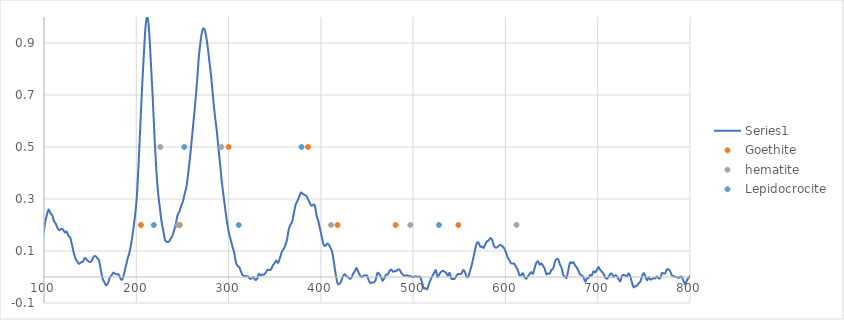
| Category | Series 0 |
|---|---|
| 1400.91602 | 0.064 |
| 1399.26172 | 0.057 |
| 1397.60742 | 0.071 |
| 1395.95313 | 0.093 |
| 1394.29883 | 0.119 |
| 1392.64258 | 0.128 |
| 1390.98828 | 0.144 |
| 1389.33203 | 0.142 |
| 1387.67578 | 0.134 |
| 1386.01758 | 0.129 |
| 1384.36133 | 0.134 |
| 1382.70313 | 0.151 |
| 1381.04688 | 0.18 |
| 1379.38867 | 0.176 |
| 1377.72852 | 0.195 |
| 1376.07031 | 0.202 |
| 1374.41016 | 0.173 |
| 1372.75195 | 0.185 |
| 1371.0918 | 0.185 |
| 1369.43164 | 0.189 |
| 1367.76953 | 0.193 |
| 1366.10938 | 0.193 |
| 1364.44727 | 0.203 |
| 1362.78516 | 0.211 |
| 1361.12305 | 0.207 |
| 1359.46094 | 0.225 |
| 1357.79688 | 0.219 |
| 1356.13281 | 0.207 |
| 1354.46875 | 0.185 |
| 1352.80469 | 0.186 |
| 1351.14063 | 0.185 |
| 1349.47656 | 0.18 |
| 1347.81055 | 0.201 |
| 1346.14453 | 0.217 |
| 1344.47852 | 0.225 |
| 1342.8125 | 0.229 |
| 1341.14453 | 0.218 |
| 1339.47852 | 0.216 |
| 1337.81055 | 0.24 |
| 1336.14258 | 0.231 |
| 1334.47461 | 0.247 |
| 1332.80469 | 0.239 |
| 1331.13477 | 0.236 |
| 1329.4668 | 0.228 |
| 1327.79688 | 0.201 |
| 1326.125 | 0.191 |
| 1324.45508 | 0.212 |
| 1322.78516 | 0.211 |
| 1321.11328 | 0.244 |
| 1319.44141 | 0.248 |
| 1317.76953 | 0.264 |
| 1316.0957 | 0.282 |
| 1314.42383 | 0.273 |
| 1312.75 | 0.276 |
| 1311.07617 | 0.29 |
| 1309.40234 | 0.288 |
| 1307.72656 | 0.29 |
| 1306.05273 | 0.287 |
| 1304.37695 | 0.265 |
| 1302.70117 | 0.283 |
| 1301.02539 | 0.292 |
| 1299.34961 | 0.294 |
| 1297.67188 | 0.291 |
| 1295.99609 | 0.272 |
| 1294.31836 | 0.264 |
| 1292.64063 | 0.274 |
| 1290.96094 | 0.259 |
| 1289.2832 | 0.293 |
| 1287.60352 | 0.308 |
| 1285.92383 | 0.295 |
| 1284.24414 | 0.284 |
| 1282.56445 | 0.292 |
| 1280.88281 | 0.32 |
| 1279.20313 | 0.357 |
| 1277.52148 | 0.36 |
| 1275.83984 | 0.351 |
| 1274.1582 | 0.313 |
| 1272.47461 | 0.277 |
| 1270.79297 | 0.251 |
| 1269.10938 | 0.244 |
| 1267.42578 | 0.266 |
| 1265.74023 | 0.318 |
| 1264.05664 | 0.314 |
| 1262.37109 | 0.301 |
| 1260.68555 | 0.293 |
| 1259.0 | 0.267 |
| 1257.31445 | 0.229 |
| 1255.62891 | 0.208 |
| 1253.94141 | 0.217 |
| 1252.25391 | 0.239 |
| 1250.56641 | 0.236 |
| 1248.87891 | 0.25 |
| 1247.19141 | 0.257 |
| 1245.50195 | 0.245 |
| 1243.8125 | 0.217 |
| 1242.12305 | 0.193 |
| 1240.43359 | 0.177 |
| 1238.74414 | 0.163 |
| 1237.05273 | 0.153 |
| 1235.36133 | 0.161 |
| 1233.66992 | 0.156 |
| 1231.97852 | 0.159 |
| 1230.28711 | 0.144 |
| 1228.59375 | 0.119 |
| 1226.90039 | 0.108 |
| 1225.20703 | 0.118 |
| 1223.51367 | 0.123 |
| 1221.82031 | 0.134 |
| 1220.125 | 0.14 |
| 1218.42969 | 0.134 |
| 1216.73438 | 0.122 |
| 1215.03906 | 0.095 |
| 1213.34375 | 0.077 |
| 1211.64648 | 0.084 |
| 1209.95117 | 0.069 |
| 1208.25391 | 0.062 |
| 1206.55469 | 0.05 |
| 1204.85742 | 0.038 |
| 1203.1582 | 0.025 |
| 1201.46094 | 0.012 |
| 1199.76172 | 0.018 |
| 1198.0625 | 0.024 |
| 1196.36133 | 0.022 |
| 1194.66211 | 0.035 |
| 1192.96094 | 0.032 |
| 1191.25977 | 0.036 |
| 1189.55859 | 0.039 |
| 1187.85547 | 0.029 |
| 1186.1543 | 0.043 |
| 1184.45117 | 0.039 |
| 1182.74805 | 0.016 |
| 1181.04492 | 0.008 |
| 1179.33984 | 0.002 |
| 1177.63672 | -0.011 |
| 1175.93164 | -0.008 |
| 1174.22656 | -0.001 |
| 1172.52148 | 0.013 |
| 1170.81641 | 0.017 |
| 1169.10938 | 0.006 |
| 1167.40234 | 0.012 |
| 1165.69531 | 0.016 |
| 1163.98828 | 0.011 |
| 1162.28125 | 0.012 |
| 1160.57227 | 0.013 |
| 1158.86328 | -0.008 |
| 1157.1543 | -0.025 |
| 1155.44531 | -0.016 |
| 1153.73633 | 0 |
| 1152.02539 | 0.002 |
| 1150.31445 | 0.007 |
| 1148.60352 | 0.01 |
| 1146.89258 | 0.004 |
| 1145.18164 | -0.012 |
| 1143.46875 | -0.022 |
| 1141.75586 | -0.006 |
| 1140.04297 | 0.015 |
| 1138.33008 | -0.002 |
| 1136.61719 | -0.004 |
| 1134.90234 | 0.013 |
| 1133.1875 | -0.006 |
| 1131.47266 | -0.012 |
| 1129.75781 | -0.009 |
| 1128.04297 | -0.008 |
| 1126.32617 | 0.004 |
| 1124.60938 | 0.002 |
| 1122.89258 | -0.001 |
| 1121.17578 | 0.007 |
| 1119.45898 | -0.007 |
| 1117.74023 | 0.003 |
| 1116.02148 | -0.001 |
| 1114.30273 | -0.015 |
| 1112.58398 | -0.001 |
| 1110.86328 | 0 |
| 1109.14453 | -0.017 |
| 1107.42383 | -0.004 |
| 1105.70313 | -0.005 |
| 1103.98242 | 0.002 |
| 1102.25977 | 0.002 |
| 1100.53711 | -0.007 |
| 1098.81641 | -0.008 |
| 1097.09375 | -0.016 |
| 1095.36914 | -0.031 |
| 1093.64648 | -0.02 |
| 1091.92188 | -0.03 |
| 1090.19727 | -0.027 |
| 1088.47266 | -0.011 |
| 1086.74805 | 0 |
| 1085.02148 | -0.021 |
| 1083.29688 | -0.003 |
| 1081.57031 | 0.003 |
| 1079.84375 | 0.018 |
| 1078.11523 | 0.004 |
| 1076.38867 | 0 |
| 1074.66016 | 0.007 |
| 1072.93164 | 0.012 |
| 1071.20313 | -0.023 |
| 1069.47461 | -0.004 |
| 1067.74414 | -0.002 |
| 1066.01367 | 0 |
| 1064.2832 | -0.019 |
| 1062.55273 | -0.01 |
| 1060.82227 | -0.012 |
| 1059.08984 | -0.008 |
| 1057.35742 | -0.009 |
| 1055.625 | 0.003 |
| 1053.89258 | 0.008 |
| 1052.16016 | 0.014 |
| 1050.42578 | 0.01 |
| 1048.69141 | 0.016 |
| 1046.95703 | 0.013 |
| 1045.22266 | 0.02 |
| 1043.48828 | 0.021 |
| 1041.75195 | 0.015 |
| 1040.01563 | 0.026 |
| 1038.2793 | 0.022 |
| 1036.54297 | 0 |
| 1034.80664 | 0.007 |
| 1033.06836 | -0.015 |
| 1031.33008 | -0.016 |
| 1029.5918 | -0.016 |
| 1027.85352 | -0.013 |
| 1026.11328 | 0.024 |
| 1024.375 | 0.036 |
| 1022.63477 | 0.028 |
| 1020.89258 | 0.045 |
| 1019.15234 | 0.018 |
| 1017.41211 | 0.009 |
| 1015.66992 | 0.001 |
| 1013.92773 | 0.009 |
| 1012.18555 | 0.017 |
| 1010.44336 | 0.015 |
| 1008.69922 | 0.014 |
| 1006.95508 | 0.014 |
| 1005.21094 | 0.004 |
| 1003.4668 | -0.007 |
| 1001.72266 | -0.011 |
| 999.97656 | 0.008 |
| 998.23047 | 0.01 |
| 996.48438 | 0.017 |
| 994.73828 | 0.021 |
| 992.99219 | 0.028 |
| 991.24414 | 0.019 |
| 989.49609 | 0.011 |
| 987.74805 | 0.005 |
| 986.0 | 0.004 |
| 984.25 | 0.003 |
| 982.50195 | 0.013 |
| 980.75195 | 0.008 |
| 979.00195 | 0.029 |
| 977.25 | 0.038 |
| 975.5 | 0.047 |
| 973.74805 | 0.044 |
| 971.99609 | 0.032 |
| 970.24414 | 0.016 |
| 968.49219 | 0.013 |
| 966.73828 | -0.014 |
| 964.98438 | -0.001 |
| 963.23047 | 0.007 |
| 961.47656 | 0.013 |
| 959.72266 | 0.019 |
| 957.9668 | 0.006 |
| 956.21094 | 0 |
| 954.45508 | -0.018 |
| 952.69922 | -0.027 |
| 950.94336 | -0.008 |
| 949.18555 | -0.012 |
| 947.42773 | 0.006 |
| 945.66992 | 0.035 |
| 943.91211 | 0.044 |
| 942.15234 | 0.046 |
| 940.39453 | 0.035 |
| 938.63477 | 0.032 |
| 936.875 | 0.028 |
| 935.11328 | 0.015 |
| 933.35352 | 0.017 |
| 931.5918 | 0.021 |
| 929.83008 | 0.031 |
| 928.06836 | 0.02 |
| 926.30664 | 0.019 |
| 924.54297 | 0.016 |
| 922.7793 | 0.012 |
| 921.01563 | 0.023 |
| 919.25195 | 0.031 |
| 917.48633 | 0.027 |
| 915.72266 | 0.034 |
| 913.95703 | 0.022 |
| 912.19141 | 0.012 |
| 910.42578 | 0.003 |
| 908.6582 | -0.014 |
| 906.89063 | -0.011 |
| 905.12305 | 0.007 |
| 903.35547 | 0.011 |
| 901.58789 | 0.022 |
| 899.81836 | 0.021 |
| 898.05078 | 0.025 |
| 896.28125 | 0.001 |
| 894.51172 | -0.014 |
| 892.74023 | -0.015 |
| 890.9707 | -0.014 |
| 889.19922 | -0.01 |
| 887.42773 | -0.005 |
| 885.6543 | -0.003 |
| 883.88281 | 0.007 |
| 882.10938 | -0.004 |
| 880.33594 | 0.003 |
| 878.5625 | -0.001 |
| 876.78906 | 0 |
| 875.01367 | -0.011 |
| 873.24023 | -0.015 |
| 871.46484 | 0.003 |
| 869.68945 | 0.005 |
| 867.91211 | 0.017 |
| 866.13672 | 0.018 |
| 864.35938 | 0.021 |
| 862.58203 | 0.027 |
| 860.80469 | 0 |
| 859.02539 | -0.007 |
| 857.24609 | -0.01 |
| 855.46875 | -0.018 |
| 853.68945 | -0.016 |
| 851.9082 | -0.016 |
| 850.12891 | -0.003 |
| 848.34766 | 0.011 |
| 846.56641 | 0.007 |
| 844.78516 | 0.015 |
| 843.00391 | 0.013 |
| 841.2207 | 0.011 |
| 839.4375 | -0.011 |
| 837.6543 | -0.017 |
| 835.87109 | -0.023 |
| 834.08594 | -0.024 |
| 832.30273 | -0.014 |
| 830.51758 | -0.008 |
| 828.73242 | 0.002 |
| 826.94727 | 0.005 |
| 825.16016 | -0.009 |
| 823.37305 | 0.002 |
| 821.58594 | 0.004 |
| 819.79883 | 0.013 |
| 818.01172 | 0.025 |
| 816.22266 | 0.019 |
| 814.43359 | 0.025 |
| 812.64453 | 0.028 |
| 810.85547 | 0.015 |
| 809.06641 | 0.008 |
| 807.27539 | 0.012 |
| 805.48438 | 0.024 |
| 803.69336 | 0.023 |
| 801.90234 | 0.017 |
| 800.10938 | 0.004 |
| 798.31836 | -0.003 |
| 796.52539 | -0.014 |
| 794.73047 | -0.029 |
| 792.9375 | -0.015 |
| 791.14258 | 0.001 |
| 789.34961 | 0.001 |
| 787.55469 | -0.004 |
| 785.75781 | 0 |
| 783.96289 | 0.001 |
| 782.16602 | 0.004 |
| 780.36914 | 0.006 |
| 778.57227 | 0.023 |
| 776.77539 | 0.029 |
| 774.97656 | 0.029 |
| 773.17773 | 0.015 |
| 771.37891 | 0.014 |
| 769.58008 | 0.015 |
| 767.78125 | -0.004 |
| 765.98047 | -0.005 |
| 764.17969 | 0.002 |
| 762.37891 | -0.006 |
| 760.57813 | -0.004 |
| 758.77539 | -0.008 |
| 756.97461 | -0.01 |
| 755.17188 | -0.002 |
| 753.36914 | -0.013 |
| 751.56445 | 0.004 |
| 749.76172 | 0.015 |
| 747.95703 | 0.001 |
| 746.15234 | -0.018 |
| 744.34766 | -0.024 |
| 742.54102 | -0.033 |
| 740.73438 | -0.035 |
| 738.92969 | -0.039 |
| 737.12109 | -0.022 |
| 735.31445 | 0.002 |
| 733.50586 | 0.014 |
| 731.69922 | 0.003 |
| 729.89063 | 0.006 |
| 728.08008 | 0.008 |
| 726.27148 | 0.005 |
| 724.46094 | -0.016 |
| 722.65234 | -0.009 |
| 720.83984 | 0.003 |
| 719.0293 | 0.007 |
| 717.21875 | -0.001 |
| 715.40625 | 0.013 |
| 713.59375 | 0.012 |
| 711.78125 | 0 |
| 709.9668 | -0.007 |
| 708.1543 | -0.001 |
| 706.33984 | 0.012 |
| 704.52539 | 0.02 |
| 702.70898 | 0.028 |
| 700.89453 | 0.038 |
| 699.07813 | 0.027 |
| 697.26172 | 0.018 |
| 695.44531 | 0.022 |
| 693.62891 | 0.006 |
| 691.81055 | 0.008 |
| 689.99219 | -0.003 |
| 688.17383 | -0.007 |
| 686.35547 | -0.017 |
| 684.53516 | 0 |
| 682.7168 | 0.006 |
| 680.89648 | 0.01 |
| 679.07617 | 0.024 |
| 677.25391 | 0.037 |
| 675.43359 | 0.045 |
| 673.61133 | 0.056 |
| 671.78906 | 0.053 |
| 669.9668 | 0.055 |
| 668.14258 | 0.027 |
| 666.31836 | -0.003 |
| 664.49609 | 0.001 |
| 662.66992 | 0.008 |
| 660.8457 | 0.034 |
| 659.01953 | 0.049 |
| 657.19531 | 0.067 |
| 655.36914 | 0.069 |
| 653.54102 | 0.057 |
| 651.71484 | 0.032 |
| 649.88672 | 0.028 |
| 648.05859 | 0.013 |
| 646.23047 | 0.014 |
| 644.40234 | 0.011 |
| 642.57227 | 0.031 |
| 640.74219 | 0.043 |
| 638.91211 | 0.052 |
| 637.08203 | 0.048 |
| 635.25195 | 0.06 |
| 633.41992 | 0.054 |
| 631.58789 | 0.034 |
| 629.75586 | 0.012 |
| 627.92383 | 0.019 |
| 626.08984 | 0.011 |
| 624.25586 | 0.002 |
| 622.42188 | -0.007 |
| 620.58789 | 0 |
| 618.75391 | 0.015 |
| 616.91797 | 0.007 |
| 615.08203 | 0.008 |
| 613.24609 | 0.028 |
| 611.4082 | 0.04 |
| 609.57227 | 0.051 |
| 607.73438 | 0.052 |
| 605.89648 | 0.054 |
| 604.05859 | 0.066 |
| 602.21875 | 0.077 |
| 600.38086 | 0.097 |
| 598.54102 | 0.11 |
| 596.69922 | 0.118 |
| 594.85938 | 0.123 |
| 593.01758 | 0.121 |
| 591.17773 | 0.114 |
| 589.33594 | 0.113 |
| 587.49219 | 0.12 |
| 585.65039 | 0.143 |
| 583.80664 | 0.15 |
| 581.96289 | 0.141 |
| 580.11914 | 0.137 |
| 578.27539 | 0.127 |
| 576.42969 | 0.112 |
| 574.58398 | 0.117 |
| 572.73828 | 0.117 |
| 570.89258 | 0.132 |
| 569.04492 | 0.131 |
| 567.19922 | 0.106 |
| 565.35156 | 0.076 |
| 563.50195 | 0.046 |
| 561.6543 | 0.023 |
| 559.80469 | 0.001 |
| 557.95508 | 0.001 |
| 556.10547 | 0.019 |
| 554.25586 | 0.027 |
| 552.4043 | 0.013 |
| 550.55469 | 0.011 |
| 548.70313 | 0.011 |
| 546.84961 | 0.005 |
| 544.99805 | -0.006 |
| 543.14453 | -0.008 |
| 541.29102 | -0.006 |
| 539.4375 | 0.016 |
| 537.58398 | 0.005 |
| 535.72852 | 0.016 |
| 533.875 | 0.021 |
| 532.01953 | 0.024 |
| 530.16211 | 0.019 |
| 528.30664 | 0.01 |
| 526.44922 | 0 |
| 524.5918 | 0.026 |
| 522.73438 | 0.015 |
| 520.87695 | 0.005 |
| 519.01758 | -0.01 |
| 517.1582 | -0.026 |
| 515.29883 | -0.046 |
| 513.43945 | -0.043 |
| 511.57813 | -0.043 |
| 509.7168 | -0.022 |
| 507.85547 | 0 |
| 505.99414 | 0.001 |
| 504.13281 | 0.001 |
| 502.26953 | 0.003 |
| 500.40625 | -0.001 |
| 498.54297 | 0.002 |
| 496.67969 | 0.003 |
| 494.81445 | 0.005 |
| 492.94922 | 0.006 |
| 491.08398 | 0.005 |
| 489.21875 | 0.008 |
| 487.35352 | 0.015 |
| 485.48633 | 0.027 |
| 483.61914 | 0.029 |
| 481.75195 | 0.023 |
| 479.88281 | 0.023 |
| 478.01563 | 0.021 |
| 476.14648 | 0.029 |
| 474.27734 | 0.022 |
| 472.4082 | 0.01 |
| 470.53711 | 0.008 |
| 468.66602 | -0.005 |
| 466.79492 | -0.014 |
| 464.92383 | 0.002 |
| 463.05273 | 0.013 |
| 461.17969 | 0.014 |
| 459.30664 | -0.012 |
| 457.43359 | -0.02 |
| 455.55859 | -0.021 |
| 453.68555 | -0.023 |
| 451.81055 | -0.012 |
| 449.93555 | 0.005 |
| 448.06055 | 0.006 |
| 446.18359 | 0.005 |
| 444.30664 | -0.001 |
| 442.42969 | 0.006 |
| 440.55273 | 0.02 |
| 438.67578 | 0.035 |
| 436.79688 | 0.022 |
| 434.91797 | 0.012 |
| 433.03906 | -0.004 |
| 431.16016 | -0.006 |
| 429.2793 | 0.001 |
| 427.39844 | 0.004 |
| 425.51758 | 0.011 |
| 423.63672 | 0 |
| 421.75391 | -0.019 |
| 419.87305 | -0.027 |
| 417.99023 | -0.023 |
| 416.10547 | 0.01 |
| 414.22266 | 0.054 |
| 412.33789 | 0.095 |
| 410.45313 | 0.113 |
| 408.56836 | 0.125 |
| 406.68359 | 0.129 |
| 404.79688 | 0.12 |
| 402.91211 | 0.125 |
| 401.02344 | 0.155 |
| 399.13672 | 0.184 |
| 397.25 | 0.216 |
| 395.36133 | 0.237 |
| 393.47266 | 0.275 |
| 391.58398 | 0.277 |
| 389.69336 | 0.274 |
| 387.80469 | 0.287 |
| 385.91406 | 0.3 |
| 384.02344 | 0.312 |
| 382.13086 | 0.316 |
| 380.24023 | 0.32 |
| 378.34766 | 0.324 |
| 376.45508 | 0.308 |
| 374.56055 | 0.293 |
| 372.66797 | 0.278 |
| 370.77344 | 0.246 |
| 368.87891 | 0.213 |
| 366.98438 | 0.201 |
| 365.08789 | 0.181 |
| 363.19336 | 0.141 |
| 361.29688 | 0.121 |
| 359.40039 | 0.106 |
| 357.50195 | 0.095 |
| 355.60547 | 0.073 |
| 353.70703 | 0.054 |
| 351.80859 | 0.063 |
| 349.9082 | 0.054 |
| 348.00977 | 0.045 |
| 346.10938 | 0.03 |
| 344.20898 | 0.026 |
| 342.30859 | 0.028 |
| 340.40625 | 0.018 |
| 338.50391 | 0.009 |
| 336.60156 | 0.009 |
| 334.69922 | 0.007 |
| 332.79688 | 0.012 |
| 330.89258 | -0.007 |
| 328.98828 | -0.011 |
| 327.08398 | -0.001 |
| 325.17969 | -0.004 |
| 323.27344 | -0.007 |
| 321.36719 | 0.002 |
| 319.46094 | 0.002 |
| 317.55469 | 0.004 |
| 315.64648 | 0.005 |
| 313.74023 | 0.018 |
| 311.83203 | 0.037 |
| 309.92188 | 0.042 |
| 308.01367 | 0.056 |
| 306.10352 | 0.092 |
| 304.19336 | 0.118 |
| 302.2832 | 0.143 |
| 300.37305 | 0.17 |
| 298.46094 | 0.207 |
| 296.54883 | 0.257 |
| 294.63672 | 0.31 |
| 292.72461 | 0.365 |
| 290.81055 | 0.434 |
| 288.89648 | 0.501 |
| 286.98242 | 0.569 |
| 285.06836 | 0.624 |
| 283.15234 | 0.692 |
| 281.23828 | 0.767 |
| 279.32227 | 0.827 |
| 277.4043 | 0.884 |
| 275.48828 | 0.929 |
| 273.57031 | 0.955 |
| 271.65234 | 0.949 |
| 269.73438 | 0.908 |
| 267.81641 | 0.848 |
| 265.89648 | 0.755 |
| 263.97656 | 0.671 |
| 262.05664 | 0.6 |
| 260.13672 | 0.529 |
| 258.21484 | 0.46 |
| 256.29297 | 0.4 |
| 254.37109 | 0.348 |
| 252.44922 | 0.32 |
| 250.52539 | 0.29 |
| 248.60156 | 0.274 |
| 246.67773 | 0.251 |
| 244.75391 | 0.238 |
| 242.83008 | 0.205 |
| 240.9043 | 0.179 |
| 238.97852 | 0.157 |
| 237.05273 | 0.147 |
| 235.125 | 0.135 |
| 233.19922 | 0.136 |
| 231.27148 | 0.141 |
| 229.3418 | 0.177 |
| 227.41406 | 0.213 |
| 225.48438 | 0.268 |
| 223.55664 | 0.327 |
| 221.625 | 0.416 |
| 219.69531 | 0.542 |
| 217.76563 | 0.694 |
| 215.83398 | 0.823 |
| 213.90234 | 0.945 |
| 211.96875 | 1 |
| 210.03711 | 0.963 |
| 208.10352 | 0.851 |
| 206.16992 | 0.721 |
| 204.23633 | 0.571 |
| 202.30078 | 0.421 |
| 200.36719 | 0.298 |
| 198.43164 | 0.23 |
| 196.49414 | 0.176 |
| 194.55859 | 0.13 |
| 192.62109 | 0.095 |
| 190.68359 | 0.072 |
| 188.74609 | 0.042 |
| 186.80859 | 0.014 |
| 184.86914 | -0.009 |
| 182.92969 | -0.007 |
| 180.99023 | 0.009 |
| 179.05078 | 0.01 |
| 177.10938 | 0.012 |
| 175.16797 | 0.017 |
| 173.22656 | 0.006 |
| 171.28516 | -0.002 |
| 169.3418 | -0.023 |
| 167.40039 | -0.032 |
| 165.45703 | -0.02 |
| 163.51172 | -0.006 |
| 161.56836 | 0.027 |
| 159.62305 | 0.064 |
| 157.67773 | 0.072 |
| 155.73242 | 0.08 |
| 153.78516 | 0.077 |
| 151.83984 | 0.064 |
| 149.89258 | 0.057 |
| 147.94336 | 0.061 |
| 145.99609 | 0.068 |
| 144.04688 | 0.073 |
| 142.09766 | 0.059 |
| 140.14844 | 0.057 |
| 138.19922 | 0.051 |
| 136.24805 | 0.058 |
| 134.29688 | 0.07 |
| 132.3457 | 0.092 |
| 130.39453 | 0.123 |
| 128.44141 | 0.151 |
| 126.48828 | 0.158 |
| 124.53516 | 0.174 |
| 122.58203 | 0.171 |
| 120.62695 | 0.183 |
| 118.67383 | 0.185 |
| 116.71875 | 0.18 |
| 114.76172 | 0.187 |
| 112.80664 | 0.204 |
| 110.84961 | 0.215 |
| 108.89258 | 0.237 |
| 106.93555 | 0.245 |
| 104.97656 | 0.259 |
| 103.01758 | 0.238 |
| 101.05859 | 0.206 |
| 99.09961 | 0.156 |
| 97.14063 | 0.123 |
| 95.17969 | 0.085 |
| 93.21875 | 0.053 |
| 91.25781 | 0.013 |
| 89.29492 | 0.004 |
| 87.33398 | -0.005 |
| 85.37109 | 0.008 |
| 83.4082 | 0.013 |
| 81.44336 | 0.035 |
| 79.48047 | 0.043 |
| 77.51563 | 0.049 |
| 75.55078 | 0.047 |
| 73.58398 | 0.051 |
| 71.61914 | 0.054 |
| 69.65234 | 0.094 |
| 67.68555 | 0.095 |
| 65.7168 | 0.069 |
| 63.75 | 0.019 |
| 61.78125 | -0.034 |